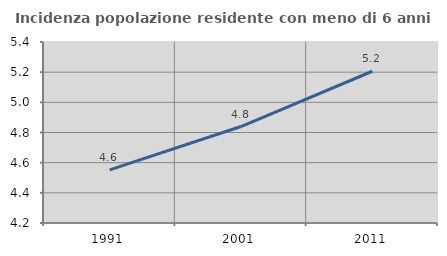
| Category | Incidenza popolazione residente con meno di 6 anni |
|---|---|
| 1991.0 | 4.552 |
| 2001.0 | 4.84 |
| 2011.0 | 5.206 |